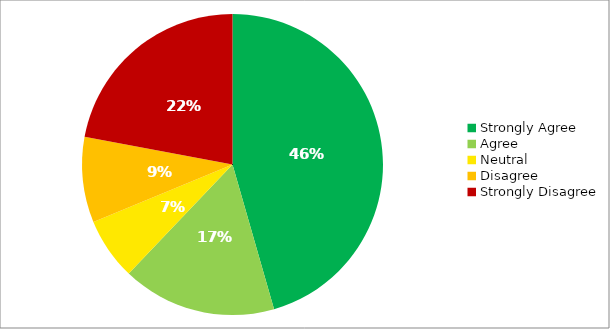
| Category | Responses |
|---|---|
| Strongly Agree | 0.455 |
| Agree | 0.166 |
| Neutral | 0.067 |
| Disagree | 0.092 |
| Strongly Disagree | 0.221 |